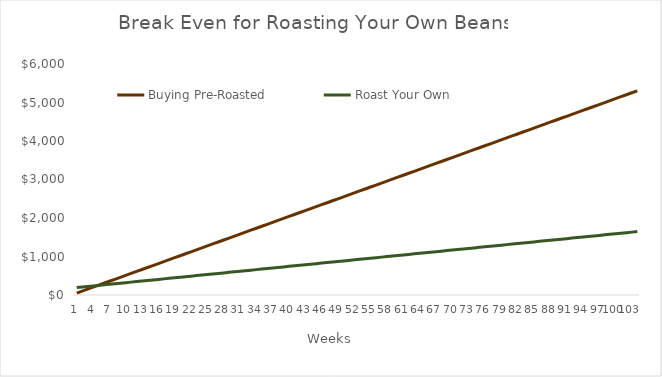
| Category | Buying Pre-Roasted | Roast Your Own |
|---|---|---|
| 0 | 51 | 193.118 |
| 1 | 102 | 207.235 |
| 2 | 153 | 221.353 |
| 3 | 204 | 235.471 |
| 4 | 255 | 249.588 |
| 5 | 306 | 263.706 |
| 6 | 357 | 277.824 |
| 7 | 408 | 291.941 |
| 8 | 459 | 306.059 |
| 9 | 510 | 320.176 |
| 10 | 561 | 334.294 |
| 11 | 612 | 348.412 |
| 12 | 663 | 362.529 |
| 13 | 714 | 376.647 |
| 14 | 765 | 390.765 |
| 15 | 816 | 404.882 |
| 16 | 867 | 419 |
| 17 | 918 | 433.118 |
| 18 | 969 | 447.235 |
| 19 | 1020 | 461.353 |
| 20 | 1071 | 475.471 |
| 21 | 1122 | 489.588 |
| 22 | 1173 | 503.706 |
| 23 | 1224 | 517.824 |
| 24 | 1275 | 531.941 |
| 25 | 1326 | 546.059 |
| 26 | 1377 | 560.176 |
| 27 | 1428 | 574.294 |
| 28 | 1479 | 588.412 |
| 29 | 1530 | 602.529 |
| 30 | 1581 | 616.647 |
| 31 | 1632 | 630.765 |
| 32 | 1683 | 644.882 |
| 33 | 1734 | 659 |
| 34 | 1785 | 673.118 |
| 35 | 1836 | 687.235 |
| 36 | 1887 | 701.353 |
| 37 | 1938 | 715.471 |
| 38 | 1989 | 729.588 |
| 39 | 2040 | 743.706 |
| 40 | 2091 | 757.824 |
| 41 | 2142 | 771.941 |
| 42 | 2193 | 786.059 |
| 43 | 2244 | 800.176 |
| 44 | 2295 | 814.294 |
| 45 | 2346 | 828.412 |
| 46 | 2397 | 842.529 |
| 47 | 2448 | 856.647 |
| 48 | 2499 | 870.765 |
| 49 | 2550 | 884.882 |
| 50 | 2601 | 899 |
| 51 | 2652 | 913.118 |
| 52 | 2703 | 927.235 |
| 53 | 2754 | 941.353 |
| 54 | 2805 | 955.471 |
| 55 | 2856 | 969.588 |
| 56 | 2907 | 983.706 |
| 57 | 2958 | 997.824 |
| 58 | 3009 | 1011.941 |
| 59 | 3060 | 1026.059 |
| 60 | 3111 | 1040.176 |
| 61 | 3162 | 1054.294 |
| 62 | 3213 | 1068.412 |
| 63 | 3264 | 1082.529 |
| 64 | 3315 | 1096.647 |
| 65 | 3366 | 1110.765 |
| 66 | 3417 | 1124.882 |
| 67 | 3468 | 1139 |
| 68 | 3519 | 1153.118 |
| 69 | 3570 | 1167.235 |
| 70 | 3621 | 1181.353 |
| 71 | 3672 | 1195.471 |
| 72 | 3723 | 1209.588 |
| 73 | 3774 | 1223.706 |
| 74 | 3825 | 1237.824 |
| 75 | 3876 | 1251.941 |
| 76 | 3927 | 1266.059 |
| 77 | 3978 | 1280.176 |
| 78 | 4029 | 1294.294 |
| 79 | 4080 | 1308.412 |
| 80 | 4131 | 1322.529 |
| 81 | 4182 | 1336.647 |
| 82 | 4233 | 1350.765 |
| 83 | 4284 | 1364.882 |
| 84 | 4335 | 1379 |
| 85 | 4386 | 1393.118 |
| 86 | 4437 | 1407.235 |
| 87 | 4488 | 1421.353 |
| 88 | 4539 | 1435.471 |
| 89 | 4590 | 1449.588 |
| 90 | 4641 | 1463.706 |
| 91 | 4692 | 1477.824 |
| 92 | 4743 | 1491.941 |
| 93 | 4794 | 1506.059 |
| 94 | 4845 | 1520.176 |
| 95 | 4896 | 1534.294 |
| 96 | 4947 | 1548.412 |
| 97 | 4998 | 1562.529 |
| 98 | 5049 | 1576.647 |
| 99 | 5100 | 1590.765 |
| 100 | 5151 | 1604.882 |
| 101 | 5202 | 1619 |
| 102 | 5253 | 1633.118 |
| 103 | 5304 | 1647.235 |